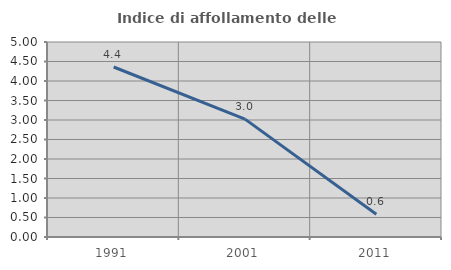
| Category | Indice di affollamento delle abitazioni  |
|---|---|
| 1991.0 | 4.359 |
| 2001.0 | 3.022 |
| 2011.0 | 0.581 |